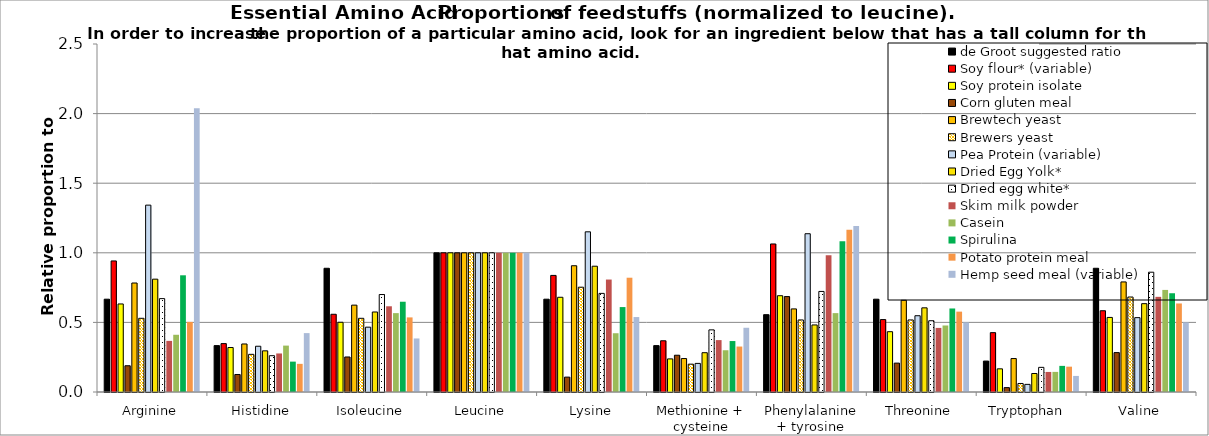
| Category | Formulated diet or pollen type (enter 100% above) | de Groot suggested ratio  | Soy flour* (variable) | Soy protein isolate | Corn gluten meal | Brewtech yeast | Brewers yeast | Pea Protein (variable) | Dried Egg Yolk* | Dried egg white* | Skim milk powder | Casein | Spirulina | Potato protein meal | Hemp seed meal (variable) | Series 14 |
|---|---|---|---|---|---|---|---|---|---|---|---|---|---|---|---|---|
| Arginine |  | 0.667 | 0.942 | 0.633 | 0.189 | 0.783 | 0.529 | 1.342 | 0.811 | 0.671 | 0.367 | 0.411 | 0.838 | 0.504 | 2.038 |  |
| Histidine |  | 0.333 | 0.348 | 0.32 | 0.126 | 0.345 | 0.271 | 0.329 | 0.296 | 0.261 | 0.277 | 0.333 | 0.218 | 0.202 | 0.423 |  |
| Isoleucine |  | 0.889 | 0.558 | 0.501 | 0.252 | 0.624 | 0.529 | 0.466 | 0.575 | 0.7 | 0.616 | 0.567 | 0.648 | 0.536 | 0.385 |  |
| Leucine |  | 1 | 1 | 1 | 1 | 1 | 1 | 1 | 1 | 1 | 1 | 1 | 1 | 1 | 1 |  |
| Lysine |  | 0.667 | 0.838 | 0.68 | 0.107 | 0.907 | 0.753 | 1.151 | 0.904 | 0.709 | 0.808 | 0.422 | 0.61 | 0.821 | 0.538 |  |
| Methionine + cysteine |  | 0.333 | 0.368 | 0.238 | 0.264 | 0.24 | 0.2 | 0.205 | 0.282 | 0.446 | 0.373 | 0.3 | 0.366 | 0.327 | 0.462 |  |
| Phenylalanine + tyrosine |  | 0.556 | 1.063 | 0.692 | 0.686 | 0.597 | 0.518 | 1.137 | 0.482 | 0.722 | 0.983 | 0.567 | 1.082 | 1.165 | 1.192 |  |
| Threonine |  | 0.667 | 0.52 | 0.433 | 0.208 | 0.659 | 0.518 | 0.548 | 0.605 | 0.512 | 0.46 | 0.478 | 0.6 | 0.577 | 0.5 |  |
| Tryptophan  |  | 0.222 | 0.426 | 0.166 | 0.031 | 0.24 | 0.061 | 0.055 | 0.133 | 0.177 | 0.144 | 0.144 | 0.188 | 0.182 | 0.115 |  |
| Valine |  | 0.889 | 0.584 | 0.536 | 0.283 | 0.791 | 0.682 | 0.534 | 0.635 | 0.861 | 0.684 | 0.733 | 0.709 | 0.636 | 0.5 |  |